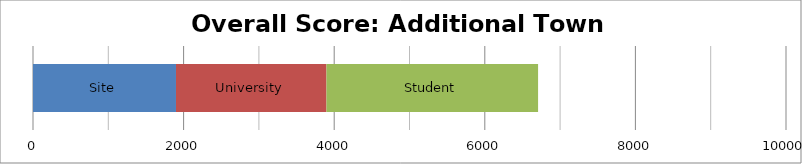
| Category | Site | University | Student |
|---|---|---|---|
| 0 | 1898.875 | 1998.375 | 2810.25 |